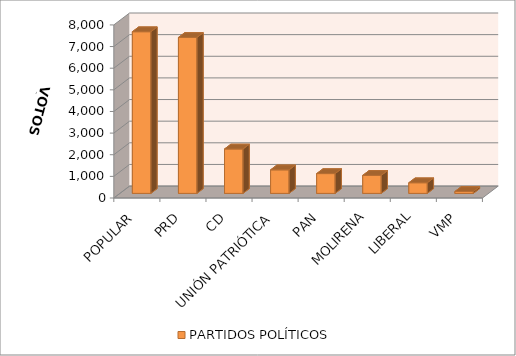
| Category | PARTIDOS POLÍTICOS |
|---|---|
| POPULAR | 7473 |
| PRD | 7208 |
| CD | 2052 |
| UNIÓN PATRIÓTICA | 1088 |
| PAN | 915 |
| MOLIRENA | 833 |
| LIBERAL | 492 |
| VMP | 88 |